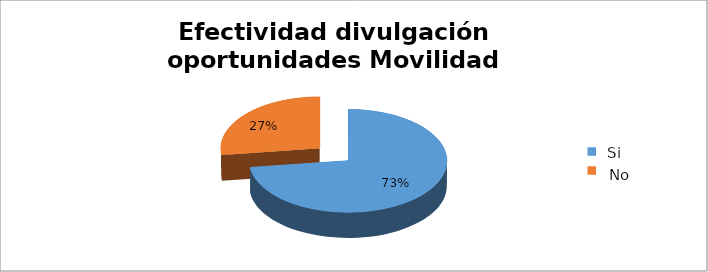
| Category | Series 0 |
|---|---|
| 0 | 0.729 |
| 1 | 0.271 |